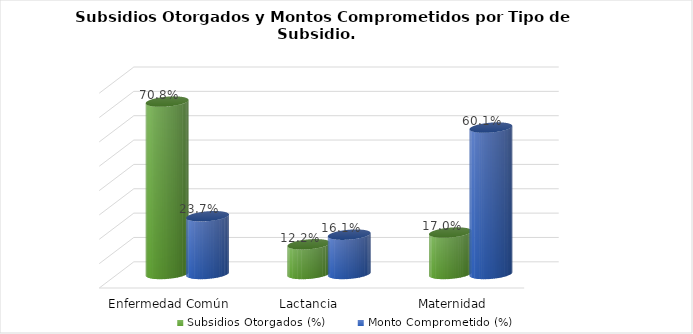
| Category | Subsidios Otorgados (%) | Monto Comprometido (%) |
|---|---|---|
| Enfermedad Común | 0.708 | 0.237 |
| Lactancia  | 0.122 | 0.161 |
| Maternidad | 0.17 | 0.601 |